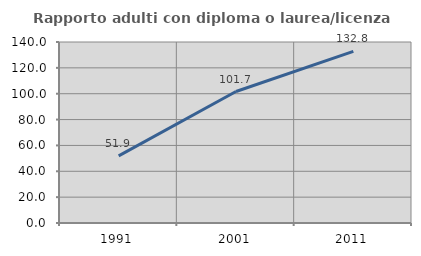
| Category | Rapporto adulti con diploma o laurea/licenza media  |
|---|---|
| 1991.0 | 51.923 |
| 2001.0 | 101.681 |
| 2011.0 | 132.773 |